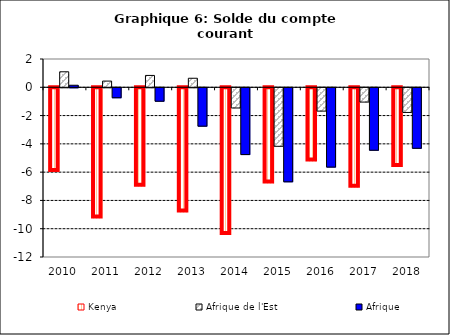
| Category | Kenya | Afrique de l'Est | Afrique |
|---|---|---|---|
| 2010.0 | -5.916 | 1.095 | 0.144 |
| 2011.0 | -9.211 | 0.439 | -0.706 |
| 2012.0 | -6.969 | 0.839 | -0.95 |
| 2013.0 | -8.788 | 0.638 | -2.715 |
| 2014.0 | -10.38 | -1.429 | -4.722 |
| 2015.0 | -6.726 | -4.138 | -6.65 |
| 2016.0 | -5.18 | -1.65 | -5.608 |
| 2017.0 | -7.041 | -1.011 | -4.418 |
| 2018.0 | -5.564 | -1.744 | -4.278 |